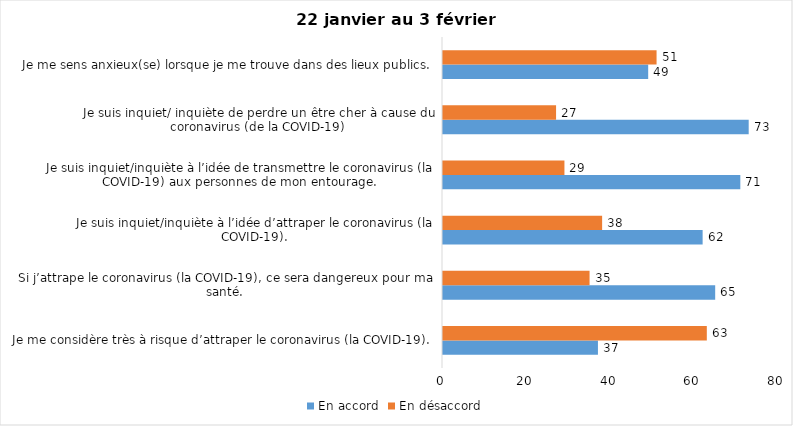
| Category | En accord | En désaccord |
|---|---|---|
| Je me considère très à risque d’attraper le coronavirus (la COVID-19). | 37 | 63 |
| Si j’attrape le coronavirus (la COVID-19), ce sera dangereux pour ma santé. | 65 | 35 |
| Je suis inquiet/inquiète à l’idée d’attraper le coronavirus (la COVID-19). | 62 | 38 |
| Je suis inquiet/inquiète à l’idée de transmettre le coronavirus (la COVID-19) aux personnes de mon entourage. | 71 | 29 |
| Je suis inquiet/ inquiète de perdre un être cher à cause du coronavirus (de la COVID-19) | 73 | 27 |
| Je me sens anxieux(se) lorsque je me trouve dans des lieux publics. | 49 | 51 |